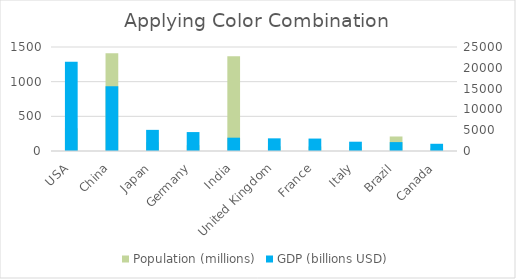
| Category | Population (millions) |
|---|---|
| USA | 328.2 |
| China | 1409 |
| Japan | 126.5 |
| Germany | 83.2 |
| India | 1366 |
| United Kingdom | 67.9 |
| France | 65.4 |
| Italy | 60.4 |
| Brazil | 209.3 |
| Canada | 37.6 |